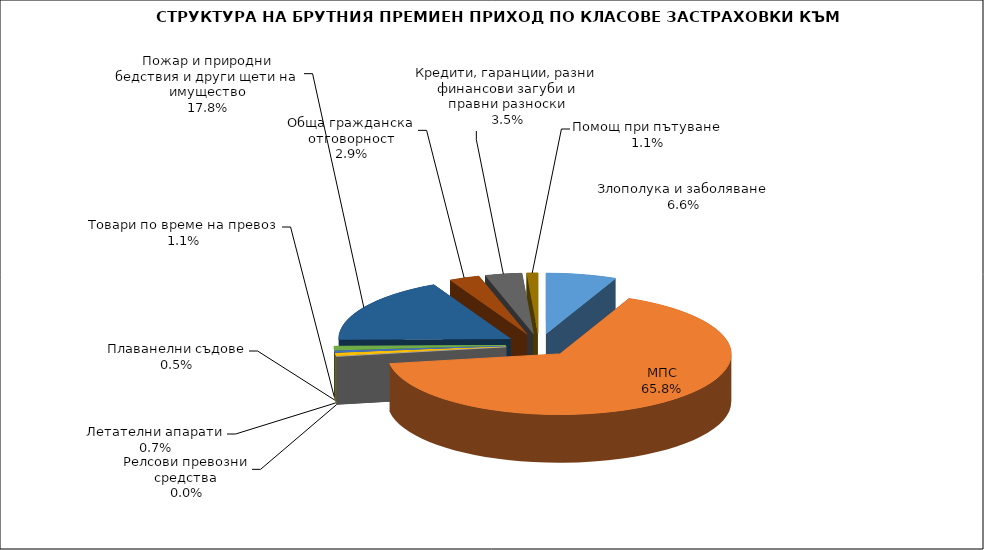
| Category | Злополука и заболяване МПС Релсови превозни средства Летателни апарати Плаванелни съдове Товари по време на превоз Пожар и природни бедствия и други щети на имущество Обща гражданска отговорност Кредити, гаранции, разни финансови загуби и правни разноски  |
|---|---|
| Злополука и заболяване | 0.066 |
| МПС | 0.658 |
| Релсови превозни средства | 0 |
| Летателни апарати | 0.007 |
| Плаванелни съдове | 0.005 |
| Товари по време на превоз | 0.011 |
| Пожар и природни бедствия и други щети на имущество | 0.178 |
| Обща гражданска отговорност | 0.029 |
| Кредити, гаранции, разни финансови загуби и правни разноски | 0.035 |
| Помощ при пътуване | 0.011 |